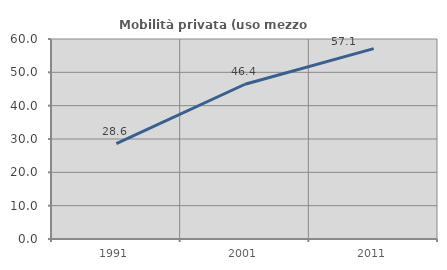
| Category | Mobilità privata (uso mezzo privato) |
|---|---|
| 1991.0 | 28.584 |
| 2001.0 | 46.425 |
| 2011.0 | 57.118 |